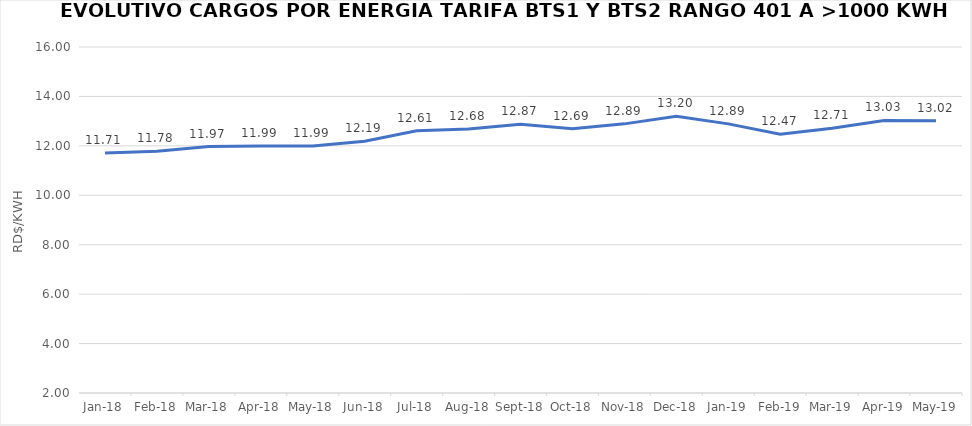
| Category | Series 0 |
|---|---|
| 2018-01-01 | 11.71 |
| 2018-02-01 | 11.78 |
| 2018-03-01 | 11.97 |
| 2018-04-01 | 11.99 |
| 2018-05-01 | 11.99 |
| 2018-06-01 | 12.19 |
| 2018-07-01 | 12.61 |
| 2018-08-01 | 12.68 |
| 2018-09-01 | 12.87 |
| 2018-10-01 | 12.69 |
| 2018-11-01 | 12.89 |
| 2018-12-01 | 13.2 |
| 2019-01-01 | 12.89 |
| 2019-02-01 | 12.47 |
| 2019-03-01 | 12.71 |
| 2019-04-01 | 13.03 |
| 2019-05-01 | 13.02 |